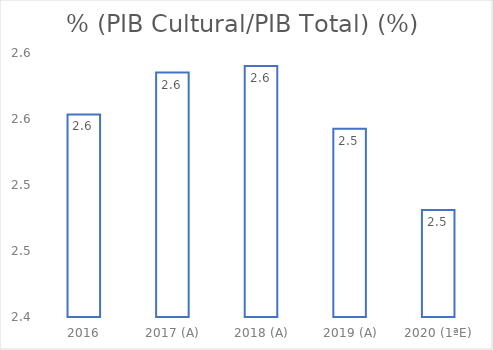
| Category | % (PIB Cultural/PIB Total) (%) |
|---|---|
| 2016 | 2.553 |
| 2017 (A) | 2.585 |
| 2018 (A) | 2.59 |
| 2019 (A) | 2.543 |
| 2020 (1ªE) | 2.481 |